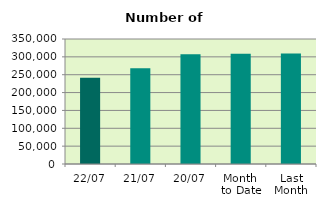
| Category | Series 0 |
|---|---|
| 22/07 | 241774 |
| 21/07 | 267882 |
| 20/07 | 307586 |
| Month 
to Date | 308915.5 |
| Last
Month | 309731.364 |